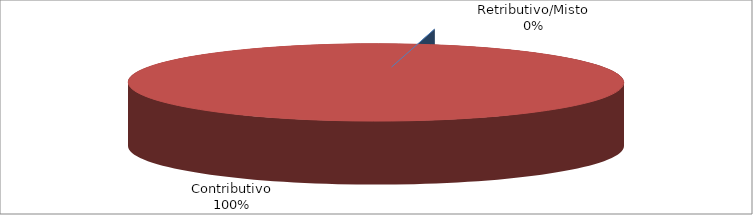
| Category | Decorrenti gennaio - giugno 2022 |
|---|---|
| Retributivo/Misto | 0 |
| Contributivo | 19622 |